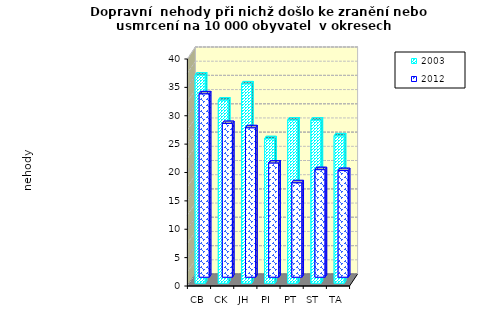
| Category | 2003 | 2012 |
|---|---|---|
| CB | 36.674 | 32.32 |
| CK | 32.276 | 27.083 |
| JH | 35.129 | 26.336 |
| PI  | 25.465 | 20.13 |
| PT | 28.759 | 16.646 |
| ST | 28.745 | 18.956 |
| TA | 25.969 | 18.791 |